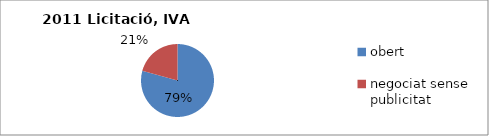
| Category | Licitació, IVA exclòs |
|---|---|
| obert | 9401396.38 |
| negociat sense publicitat  | 2454927.19 |